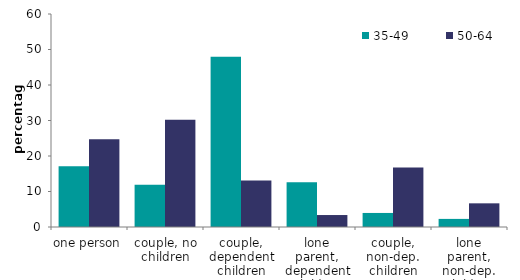
| Category | 35-49 | 50-64 |
|---|---|---|
| one person | 17.092 | 24.74 |
| couple, no children | 11.908 | 30.208 |
| couple, dependent children | 47.962 | 13.106 |
| lone parent, dependent children | 12.592 | 3.372 |
| couple, non-dep. children | 3.957 | 16.748 |
| lone parent, non-dep. children | 2.282 | 6.667 |